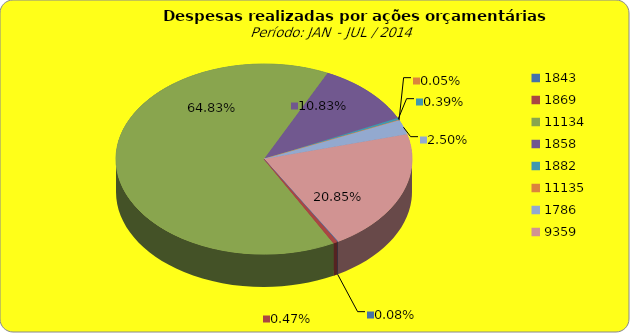
| Category | Series 1 |
|---|---|
| 1843.0 | 100000 |
| 1869.0 | 554638.79 |
| 11134.0 | 76648930.83 |
| 1858.0 | 12802211.66 |
| 1882.0 | 460659.2 |
| 11135.0 | 60771.97 |
| 1786.0 | 2952588.28 |
| 9359.0 | 24652563.32 |